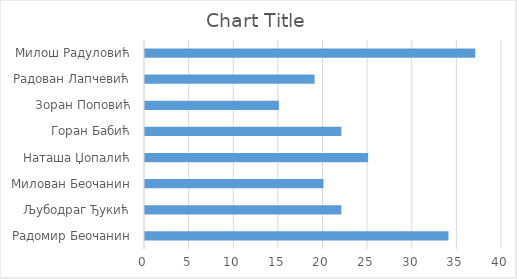
| Category | Series 0 |
|---|---|
| Радомир Беочанин | 34 |
| Љубодраг Ђукић | 22 |
| Милован Беочанин | 20 |
| Наташа Џопалић | 25 |
| Горан Бабић | 22 |
| Зоран Поповић | 15 |
| Радован Лапчевић | 19 |
| Милош Радуловић | 37 |